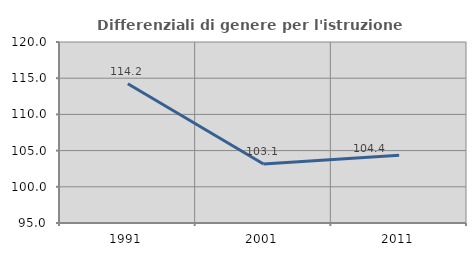
| Category | Differenziali di genere per l'istruzione superiore |
|---|---|
| 1991.0 | 114.238 |
| 2001.0 | 103.142 |
| 2011.0 | 104.353 |